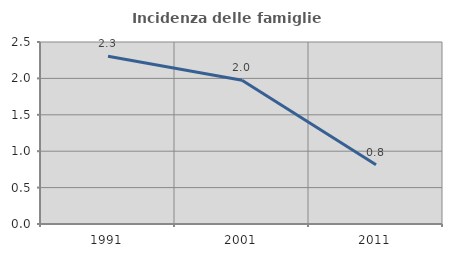
| Category | Incidenza delle famiglie numerose |
|---|---|
| 1991.0 | 2.304 |
| 2001.0 | 1.974 |
| 2011.0 | 0.814 |